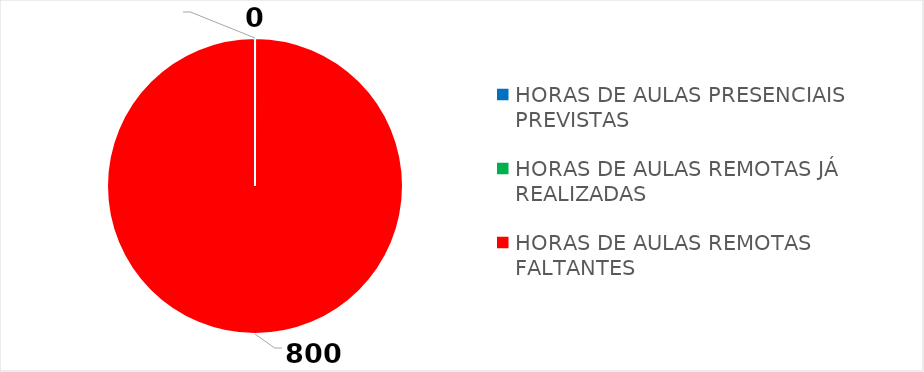
| Category | Series 0 |
|---|---|
| HORAS DE AULAS PRESENCIAIS PREVISTAS | 0 |
| HORAS DE AULAS REMOTAS JÁ REALIZADAS | 0 |
| HORAS DE AULAS REMOTAS FALTANTES | 800 |